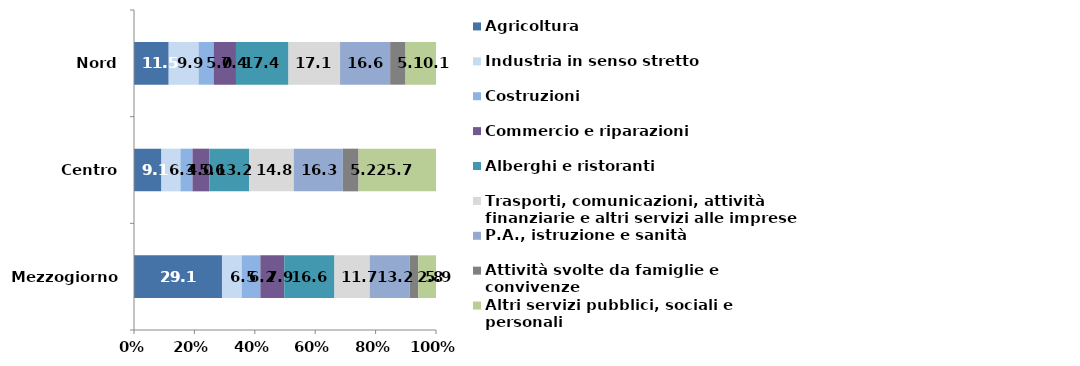
| Category | Agricoltura | Industria in senso stretto | Costruzioni | Commercio e riparazioni | Alberghi e ristoranti | Trasporti, comunicazioni, attività finanziarie e altri servizi alle imprese | P.A., istruzione e sanità | Attività svolte da famiglie e convivenze | Altri servizi pubblici, sociali e personali |
|---|---|---|---|---|---|---|---|---|---|
| Mezzogiorno | 29.1 | 6.5 | 6.2 | 7.9 | 16.6 | 11.7 | 13.2 | 2.8 | 5.9 |
| Centro | 9.1 | 6.3 | 4 | 5.6 | 13.2 | 14.8 | 16.3 | 5.2 | 25.7 |
| Nord | 11.5 | 9.9 | 5 | 7.4 | 17.4 | 17.1 | 16.6 | 5.1 | 10.1 |